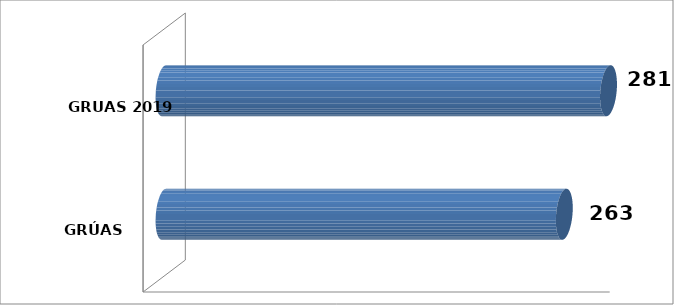
| Category | Columna1 |
|---|---|
| GRÚAS   2018 | 263 |
| GRUAS 2019 | 281 |